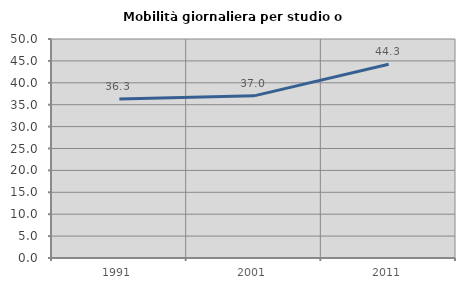
| Category | Mobilità giornaliera per studio o lavoro |
|---|---|
| 1991.0 | 36.306 |
| 2001.0 | 37.023 |
| 2011.0 | 44.251 |